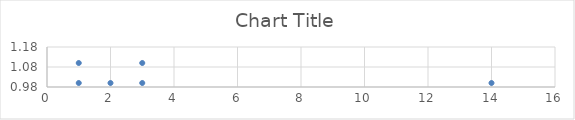
| Category | Series 0 |
|---|---|
| 1.0 | 1 |
| 1.0 | 1.1 |
| 2.0 | 1 |
| 3.0 | 1 |
| 3.0 | 1.1 |
| 14.0 | 1 |